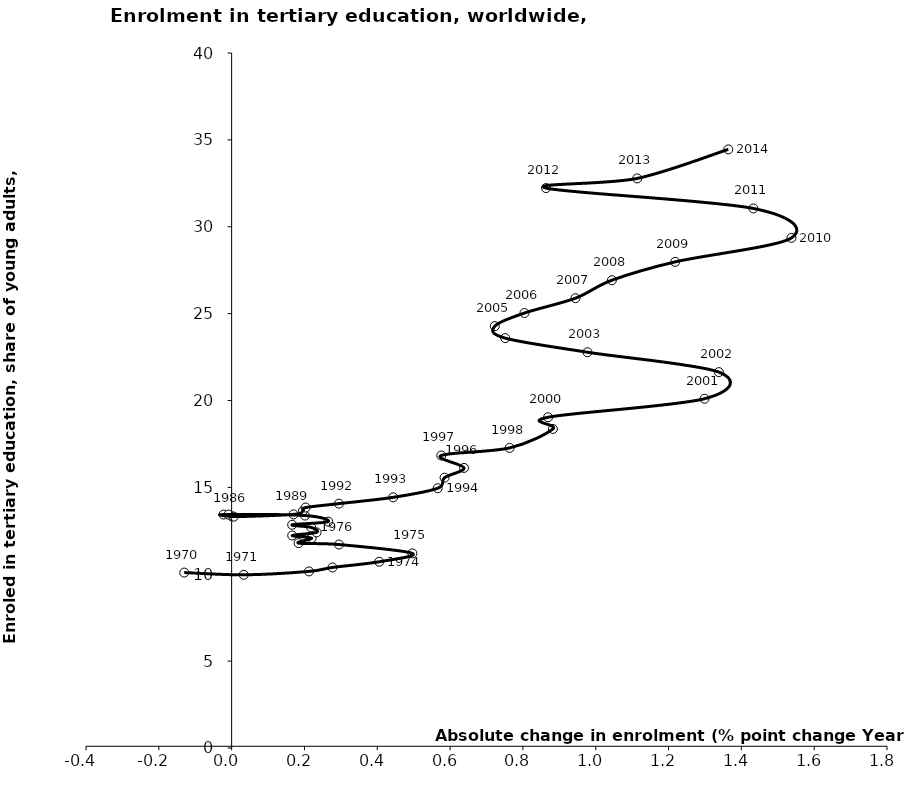
| Category | Series 0 |
|---|---|
| -0.13024997711181996 | 10.097 |
| 0.033290386199950284 | 9.967 |
| 0.2124752998352104 | 10.164 |
| 0.27690982818605026 | 10.392 |
| 0.4051246643066495 | 10.718 |
| 0.49634504318234995 | 11.202 |
| 0.29477500915525034 | 11.71 |
| 0.1838750839233496 | 11.792 |
| 0.2196650505065998 | 12.078 |
| 0.16639995574950017 | 12.231 |
| 0.23331022262575019 | 12.411 |
| 0.21842002868655008 | 12.698 |
| 0.16619968414305042 | 12.848 |
| 0.2653498649596999 | 13.03 |
| 0.20148038864134943 | 13.379 |
| -0.022194862365699564 | 13.433 |
| 0.0006546974182004561 | 13.334 |
| -0.008510112762450284 | 13.434 |
| 0.00589990615844993 | 13.317 |
| 0.17002010345454988 | 13.446 |
| 0.19621038436890004 | 13.657 |
| 0.20327472686769976 | 13.839 |
| 0.2945847511291495 | 14.064 |
| 0.44369506835935013 | 14.428 |
| 0.56590032577515 | 14.951 |
| 0.5848002433777006 | 15.56 |
| 0.6382346153259499 | 16.121 |
| 0.57575511932375 | 16.836 |
| 0.7635354995727504 | 17.272 |
| 0.8823499679565501 | 18.363 |
| 0.8692245483398491 | 19.037 |
| 1.29892444610595 | 20.102 |
| 1.33818531036375 | 21.635 |
| 0.9771900177001989 | 22.778 |
| 0.7513647079468004 | 23.589 |
| 0.7227306365966513 | 24.281 |
| 0.8042955398559499 | 25.035 |
| 0.9443092346191495 | 25.889 |
| 1.0445547103881498 | 26.923 |
| 1.2181806564331001 | 27.978 |
| 1.5376596450806002 | 29.36 |
| 1.4329156875610494 | 31.054 |
| 0.8635501861571999 | 32.225 |
| 1.1138191223144496 | 32.781 |
| 1.3640880584716992 | 34.453 |